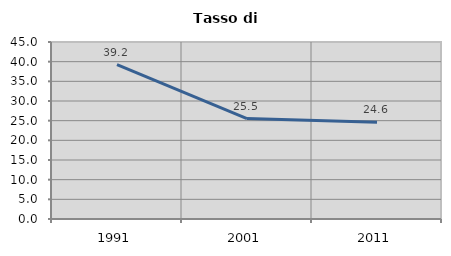
| Category | Tasso di disoccupazione   |
|---|---|
| 1991.0 | 39.241 |
| 2001.0 | 25.54 |
| 2011.0 | 24.601 |